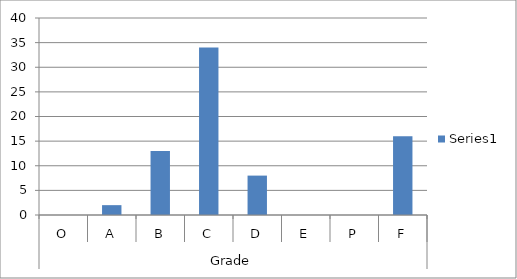
| Category | Series 0 |
|---|---|
| 0 | 0 |
| 1 | 2 |
| 2 | 13 |
| 3 | 34 |
| 4 | 8 |
| 5 | 0 |
| 6 | 0 |
| 7 | 16 |